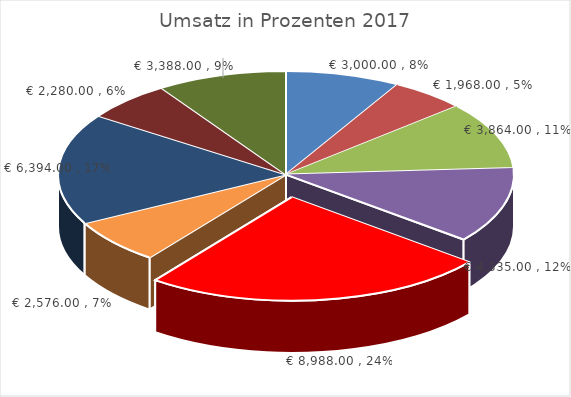
| Category | Gesamt |
|---|---|
| Gitarre A | 3000 |
| Gitarre B | 1968 |
| Gitarre C | 3864 |
| Konzertgitarre A | 4335 |
| Konzertgitarre B | 8988 |
| Konzertgitarre C | 2576 |
| Westerngitarre A | 6394 |
| Westerngitarre B | 2280 |
| Westerngitarre C | 3388 |